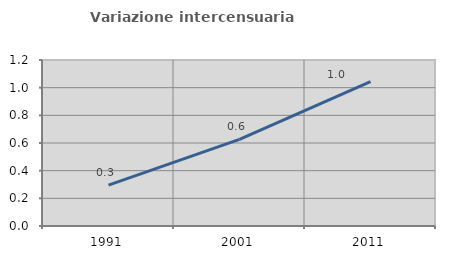
| Category | Variazione intercensuaria annua |
|---|---|
| 1991.0 | 0.295 |
| 2001.0 | 0.626 |
| 2011.0 | 1.043 |